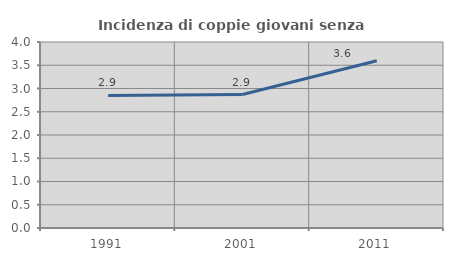
| Category | Incidenza di coppie giovani senza figli |
|---|---|
| 1991.0 | 2.851 |
| 2001.0 | 2.87 |
| 2011.0 | 3.596 |